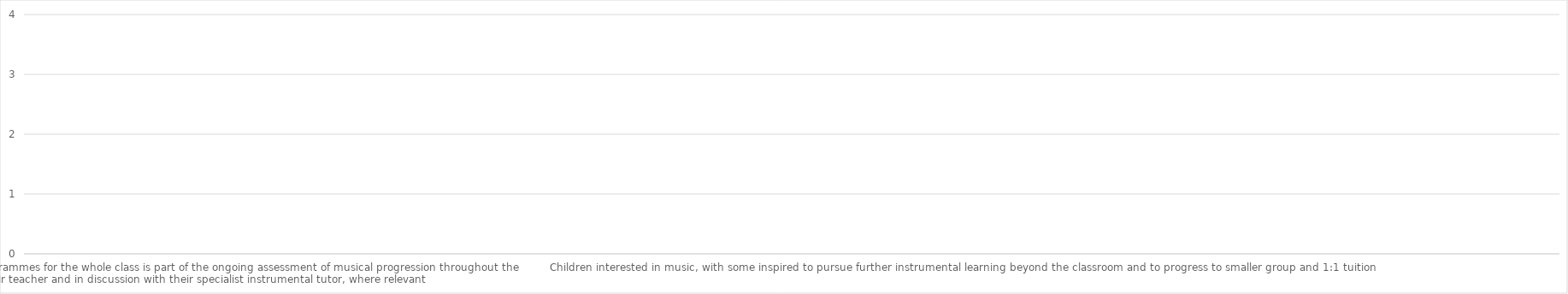
| Category | Series 0 |
|---|---|
| Understanding the impact of instrumental teaching programmes for the whole class is part of the ongoing assessment of musical progression throughout the individual pupil’s time at school, by their teacher and in discussion with their specialist instrumenta | 0 |
| Children developing in confidence playing instrument(s), with the basic skills to produce an effective sound and the beginnings of a range that enables them to play a simple tune in an ensemble with others | 0 |
| Children confident to play their instruments in curriculum lessons | 0 |
| Children confident to engage in a performing opportunities | 0 |
| Children able to make effective use of their developing instrumental skills in the curriculum music lessons that follow the provision | 0 |
| Children interested in music, with some inspired to pursue further instrumental learning beyond the classroom and to progress to smaller group and 1:1 tuition | 0 |
| Seeing higher levels of interest in instrumental lessons, and proactively support pupils’ progression to these opportunities, working with the Hub | 0 |
| Know what standards are achieved and how it is measured  | 0 |
| Communicate pupils’ progress in instrumental teaching with parents and carers, so they can together support pupils to progress to further opportunities for musical learning | 0 |